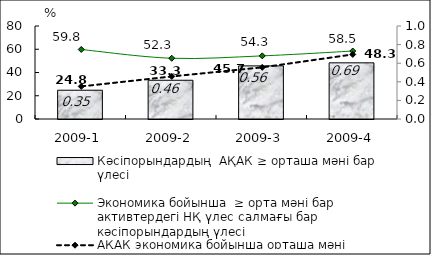
| Category | Кәсіпорындардың  АҚАК ≥ орташа мәні бар үлесі  |
|---|---|
| 2009-1 | 24.75 |
| 2009-2 | 33.33 |
| 2009-3 | 45.69 |
| 2009-4 | 48.31 |